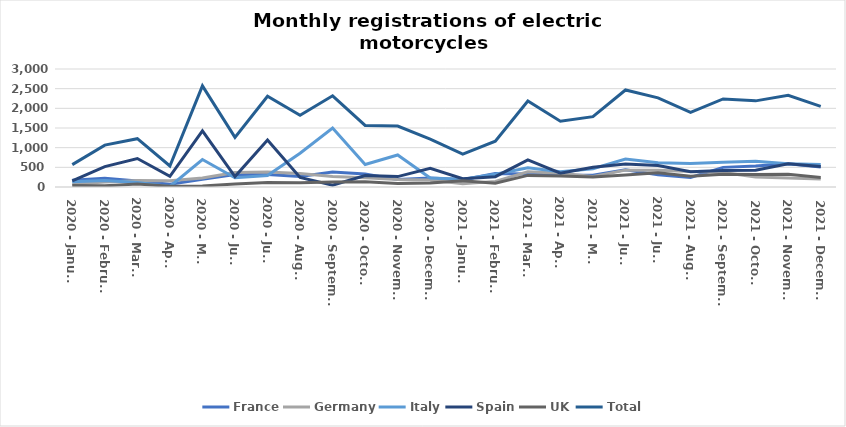
| Category | France | Germany | Italy | Spain | UK | Total |
|---|---|---|---|---|---|---|
| 2020 - January | 172 | 70 | 135 | 155 | 36 | 568 |
| 2020 - February | 225 | 124 | 167 | 519 | 30 | 1065 |
| 2020 - March | 151 | 166 | 112 | 725 | 75 | 1229 |
| 2020 - April | 68 | 162 | 12 | 273 | 19 | 534 |
| 2020 - May | 195 | 228 | 699 | 1425 | 24 | 2571 |
| 2020 - June | 317 | 367 | 235 | 266 | 78 | 1263 |
| 2020 - July | 320 | 384 | 290 | 1196 | 117 | 2307 |
| 2020 - August | 266 | 346 | 857 | 244 | 109 | 1822 |
| 2020 - September | 381 | 268 | 1498 | 44 | 127 | 2318 |
| 2020 - October | 333 | 238 | 572 | 290 | 133 | 1566 |
| 2020 - November | 188 | 193 | 814 | 264 | 89 | 1548 |
| 2020 - December | 231 | 176 | 229 | 476 | 104 | 1216 |
| 2021 - January | 183 | 83 | 197 | 211 | 160 | 834 |
| 2021 - February | 341 | 143 | 325 | 262 | 94 | 1165 |
| 2021 - March | 331 | 388 | 487 | 687 | 295 | 2188 |
| 2021 - April | 301 | 349 | 389 | 352 | 281 | 1672 |
| 2021 - May | 299 | 270 | 463 | 502 | 254 | 1788 |
| 2021 - June | 439 | 429 | 711 | 584 | 303 | 2466 |
| 2021 - July | 312 | 426 | 616 | 546 | 365 | 2265 |
| 2021 - August | 245 | 392 | 596 | 389 | 274 | 1896 |
| 2021 - September | 499 | 369 | 629 | 419 | 324 | 2240 |
| 2021 - October | 531 | 255 | 657 | 427 | 320 | 2190 |
| 2021 - November | 593 | 231 | 592 | 592 | 321 | 2329 |
| 2021 - December | 511 | 206 | 571 | 523 | 240 | 2051 |